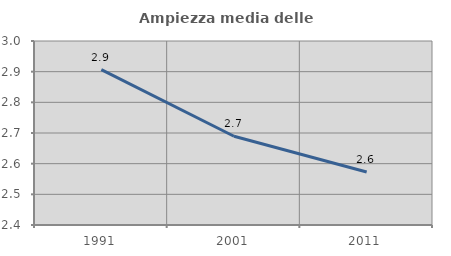
| Category | Ampiezza media delle famiglie |
|---|---|
| 1991.0 | 2.907 |
| 2001.0 | 2.689 |
| 2011.0 | 2.573 |